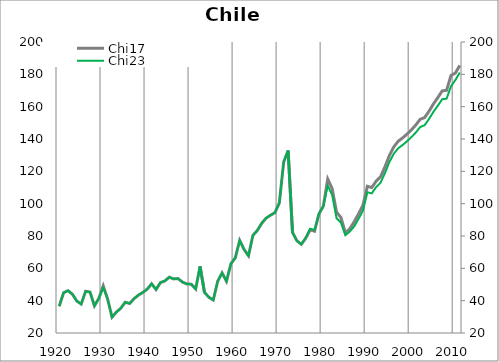
| Category | Chi17 |
|---|---|
| 1920.0 | 36.531 |
| 1921.0 | 44.893 |
| 1922.0 | 46.199 |
| 1923.0 | 43.982 |
| 1924.0 | 39.774 |
| 1925.0 | 37.905 |
| 1926.0 | 45.814 |
| 1927.0 | 45.331 |
| 1928.0 | 36.817 |
| 1929.0 | 41.367 |
| 1930.0 | 49.168 |
| 1931.0 | 41.031 |
| 1932.0 | 29.782 |
| 1933.0 | 32.96 |
| 1934.0 | 35.337 |
| 1935.0 | 39.019 |
| 1936.0 | 38.254 |
| 1937.0 | 41.205 |
| 1938.0 | 43.446 |
| 1939.0 | 45.105 |
| 1940.0 | 47.152 |
| 1941.0 | 50.42 |
| 1942.0 | 46.885 |
| 1943.0 | 51.194 |
| 1944.0 | 52.206 |
| 1945.0 | 54.526 |
| 1946.0 | 53.435 |
| 1947.0 | 53.68 |
| 1948.0 | 51.489 |
| 1949.0 | 50.336 |
| 1950.0 | 50.194 |
| 1951.0 | 47.244 |
| 1952.0 | 61.22 |
| 1953.0 | 45.164 |
| 1954.0 | 42.101 |
| 1955.0 | 40.412 |
| 1956.0 | 51.993 |
| 1957.0 | 57.162 |
| 1958.0 | 51.985 |
| 1959.0 | 62.782 |
| 1960.0 | 66.495 |
| 1961.0 | 77.286 |
| 1962.0 | 71.639 |
| 1963.0 | 67.766 |
| 1964.0 | 80.383 |
| 1965.0 | 83.419 |
| 1966.0 | 87.845 |
| 1967.0 | 91.062 |
| 1968.0 | 92.845 |
| 1969.0 | 94.445 |
| 1970.0 | 100.411 |
| 1971.0 | 125.889 |
| 1972.0 | 132.849 |
| 1973.0 | 82.21 |
| 1974.0 | 77.039 |
| 1975.0 | 74.85 |
| 1976.0 | 78.628 |
| 1977.0 | 83.783 |
| 1978.0 | 82.979 |
| 1979.0 | 93.652 |
| 1980.0 | 98.474 |
| 1981.0 | 115.249 |
| 1982.0 | 109.337 |
| 1983.0 | 94.777 |
| 1984.0 | 91.409 |
| 1985.0 | 81.955 |
| 1986.0 | 84.439 |
| 1987.0 | 88.74 |
| 1988.0 | 93.737 |
| 1989.0 | 98.969 |
| 1990.0 | 110.768 |
| 1991.0 | 109.978 |
| 1992.0 | 113.924 |
| 1993.0 | 116.637 |
| 1994.0 | 122.803 |
| 1995.0 | 129.784 |
| 1996.0 | 135.074 |
| 1997.0 | 138.626 |
| 1998.0 | 140.647 |
| 1999.0 | 143.013 |
| 2000.0 | 145.647 |
| 2001.0 | 148.659 |
| 2002.0 | 152.18 |
| 2003.0 | 153.239 |
| 2004.0 | 157.148 |
| 2005.0 | 161.663 |
| 2006.0 | 165.594 |
| 2007.0 | 169.755 |
| 2008.0 | 170.124 |
| 2009.0 | 179.286 |
| 2010.0 | 180.818 |
| 2011.0 | 185.527 |